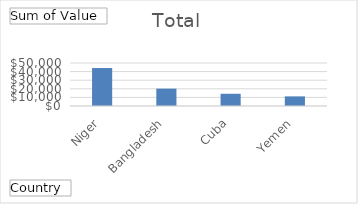
| Category | Total |
|---|---|
| Niger | 44152.4 |
| Bangladesh | 20180 |
| Cuba | 14220 |
| Yemen | 11165 |